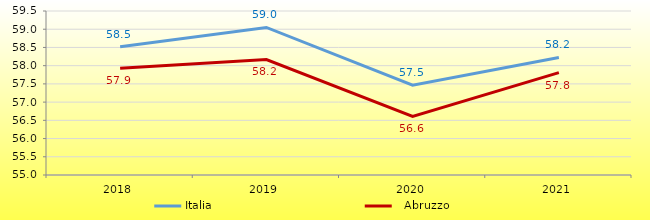
| Category | Italia |   Abruzzo |
|---|---|---|
| 2018 | 58.521 | 57.928 |
| 2019 | 59.049 | 58.169 |
| 2020 | 57.467 | 56.609 |
| 2021 | 58.224 | 57.808 |